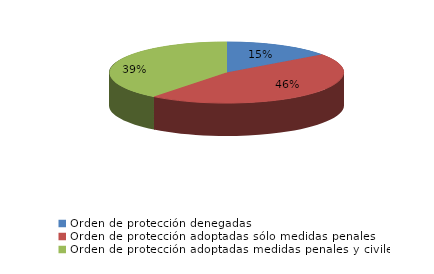
| Category | Series 0 |
|---|---|
| Orden de protección denegadas | 133 |
| Orden de protección adoptadas sólo medidas penales | 405 |
| Orden de protección adoptadas medidas penales y civiles | 350 |